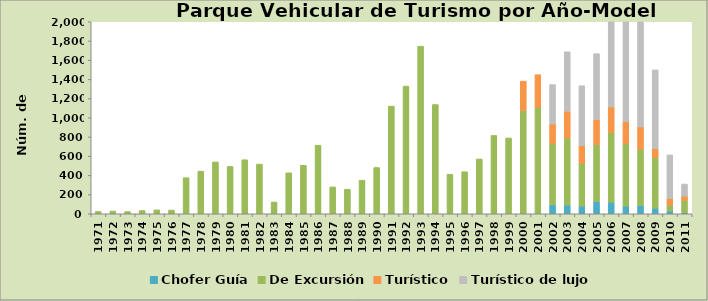
| Category | Chofer Guía | De Excursión | Turístico | Turístico de lujo |
|---|---|---|---|---|
| 1971.0 | 0 | 24 | 0 | 0 |
| 1972.0 | 0 | 28 | 0 | 0 |
| 1973.0 | 0 | 23 | 0 | 0 |
| 1974.0 | 0 | 34 | 0 | 0 |
| 1975.0 | 0 | 41 | 0 | 0 |
| 1976.0 | 0 | 39 | 0 | 0 |
| 1977.0 | 0 | 376 | 0 | 0 |
| 1978.0 | 0 | 444 | 0 | 0 |
| 1979.0 | 0 | 540 | 0 | 0 |
| 1980.0 | 0 | 493 | 0 | 0 |
| 1981.0 | 0 | 563 | 0 | 0 |
| 1982.0 | 0 | 518 | 0 | 0 |
| 1983.0 | 0 | 123 | 0 | 0 |
| 1984.0 | 0 | 427 | 0 | 0 |
| 1985.0 | 0 | 505 | 0 | 0 |
| 1986.0 | 0 | 714 | 0 | 0 |
| 1987.0 | 0 | 280 | 0 | 0 |
| 1988.0 | 0 | 256 | 0 | 0 |
| 1989.0 | 0 | 350 | 0 | 0 |
| 1990.0 | 0 | 482 | 0 | 0 |
| 1991.0 | 0 | 1122 | 0 | 0 |
| 1992.0 | 0 | 1330 | 0 | 0 |
| 1993.0 | 0 | 1746 | 0 | 0 |
| 1994.0 | 0 | 1138 | 0 | 0 |
| 1995.0 | 0 | 412 | 0 | 0 |
| 1996.0 | 0 | 438 | 0 | 0 |
| 1997.0 | 0 | 571 | 0 | 0 |
| 1998.0 | 0 | 816 | 0 | 0 |
| 1999.0 | 0 | 790 | 0 | 0 |
| 2000.0 | 0 | 1075 | 307 | 0 |
| 2001.0 | 0 | 1104 | 345 | 0 |
| 2002.0 | 93 | 639 | 204 | 410 |
| 2003.0 | 91 | 698 | 279 | 620 |
| 2004.0 | 80 | 442 | 187 | 625 |
| 2005.0 | 128 | 593 | 262 | 685 |
| 2006.0 | 121 | 726 | 266 | 935 |
| 2007.0 | 80 | 653 | 226 | 1065 |
| 2008.0 | 87 | 583 | 235 | 1216 |
| 2009.0 | 58 | 525 | 97 | 819 |
| 2010.0 | 30 | 61 | 68 | 454 |
| 2011.0 | 11 | 129 | 44 | 126 |